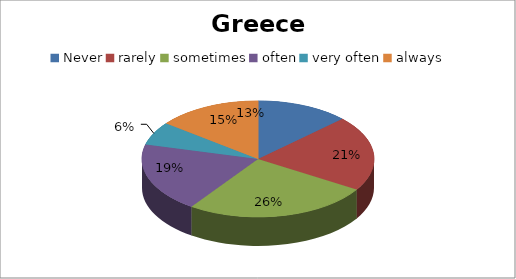
| Category | Series 0 |
|---|---|
| Never | 8 |
| rarely | 13 |
| sometimes | 16 |
| often | 12 |
| very often | 4 |
| always | 9 |